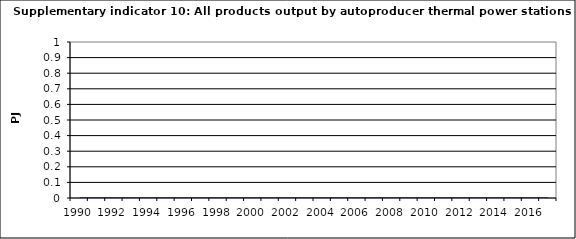
| Category | All products output by autoproducer thermal power stations, PJ |
|---|---|
| 1990 | 0 |
| 1991 | 0 |
| 1992 | 0 |
| 1993 | 0 |
| 1994 | 0 |
| 1995 | 0 |
| 1996 | 0 |
| 1997 | 0 |
| 1998 | 0 |
| 1999 | 0 |
| 2000 | 0 |
| 2001 | 0 |
| 2002 | 0 |
| 2003 | 0 |
| 2004 | 0 |
| 2005 | 0 |
| 2006 | 0 |
| 2007 | 0 |
| 2008 | 0 |
| 2009 | 0 |
| 2010 | 0 |
| 2011 | 0 |
| 2012 | 0 |
| 2013 | 0 |
| 2014 | 0 |
| 2015 | 0 |
| 2016 | 0 |
| 2017 | 0 |